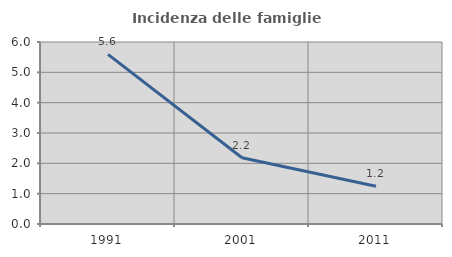
| Category | Incidenza delle famiglie numerose |
|---|---|
| 1991.0 | 5.59 |
| 2001.0 | 2.186 |
| 2011.0 | 1.246 |